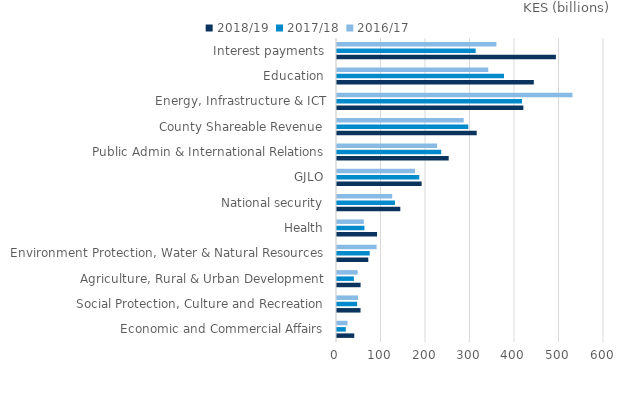
| Category | 2018/19 | 2017/18 | 2016/17 |
|---|---|---|---|
| Economic and Commercial Affairs | 38.8 | 19.8 | 23.6 |
| Social Protection, Culture and Recreation | 52.9 | 45.2 | 47.4 |
| Agriculture, Rural & Urban Development | 53 | 38 | 46.5 |
| Environment Protection, Water & Natural Resources | 70.3 | 73.5 | 89 |
| Health | 90.007 | 61.6 | 60.3 |
| National security | 142.3 | 130.2 | 124 |
| GJLO | 190.2 | 184.8 | 175.4 |
| Public Admin & International Relations | 251 | 234.1 | 224.9 |
| County Shareable Revenue | 314 | 295 | 284.8 |
| Energy, Infrastructure & ICT | 418.8 | 415.7 | 529.1 |
| Education | 442.3 | 375.3 | 339.9 |
| Interest payments | 491.927 | 311.58 | 358.18 |